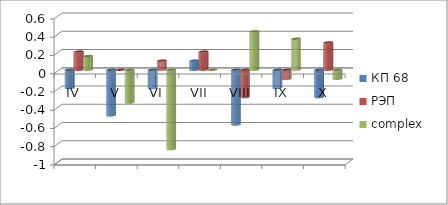
| Category | КП 68 | РЭП  | complex |
|---|---|---|---|
| IV | -0.2 | 0.2 | 0.15 |
| V | -0.5 | 0 | -0.36 |
| VI | -0.2 | 0.1 | -0.87 |
| VII | 0.1 | 0.2 | 0 |
| VIII | -0.6 | -0.3 | 0.42 |
| IX | -0.2 | -0.1 | 0.34 |
| X | -0.3 | 0.3 | -0.1 |